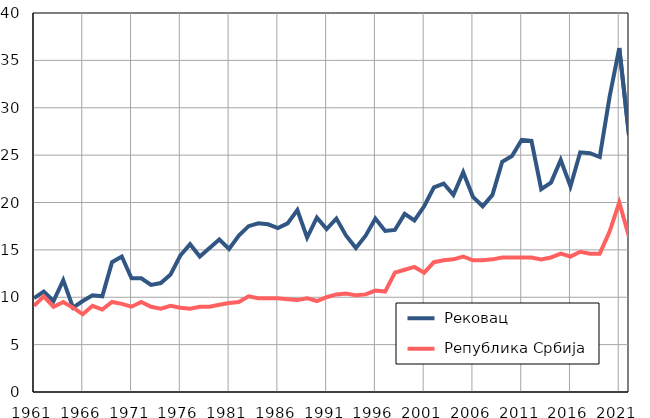
| Category |  Рековац |  Република Србија |
|---|---|---|
| 1961.0 | 9.9 | 9.1 |
| 1962.0 | 10.6 | 10.1 |
| 1963.0 | 9.6 | 9 |
| 1964.0 | 11.8 | 9.5 |
| 1965.0 | 8.9 | 8.9 |
| 1966.0 | 9.6 | 8.2 |
| 1967.0 | 10.2 | 9.1 |
| 1968.0 | 10.1 | 8.7 |
| 1969.0 | 13.7 | 9.5 |
| 1970.0 | 14.3 | 9.3 |
| 1971.0 | 12 | 9 |
| 1972.0 | 12 | 9.5 |
| 1973.0 | 11.3 | 9 |
| 1974.0 | 11.5 | 8.8 |
| 1975.0 | 12.4 | 9.1 |
| 1976.0 | 14.4 | 8.9 |
| 1977.0 | 15.6 | 8.8 |
| 1978.0 | 14.3 | 9 |
| 1979.0 | 15.2 | 9 |
| 1980.0 | 16.1 | 9.2 |
| 1981.0 | 15.1 | 9.4 |
| 1982.0 | 16.5 | 9.5 |
| 1983.0 | 17.5 | 10.1 |
| 1984.0 | 17.8 | 9.9 |
| 1985.0 | 17.7 | 9.9 |
| 1986.0 | 17.3 | 9.9 |
| 1987.0 | 17.8 | 9.8 |
| 1988.0 | 19.2 | 9.7 |
| 1989.0 | 16.3 | 9.9 |
| 1990.0 | 18.4 | 9.6 |
| 1991.0 | 17.2 | 10 |
| 1992.0 | 18.3 | 10.3 |
| 1993.0 | 16.5 | 10.4 |
| 1994.0 | 15.2 | 10.2 |
| 1995.0 | 16.5 | 10.3 |
| 1996.0 | 18.3 | 10.7 |
| 1997.0 | 17 | 10.6 |
| 1998.0 | 17.1 | 12.6 |
| 1999.0 | 18.8 | 12.9 |
| 2000.0 | 18.1 | 13.2 |
| 2001.0 | 19.6 | 12.6 |
| 2002.0 | 21.6 | 13.7 |
| 2003.0 | 22 | 13.9 |
| 2004.0 | 20.8 | 14 |
| 2005.0 | 23.2 | 14.3 |
| 2006.0 | 20.6 | 13.9 |
| 2007.0 | 19.6 | 13.9 |
| 2008.0 | 20.8 | 14 |
| 2009.0 | 24.3 | 14.2 |
| 2010.0 | 24.9 | 14.2 |
| 2011.0 | 26.6 | 14.2 |
| 2012.0 | 26.5 | 14.2 |
| 2013.0 | 21.4 | 14 |
| 2014.0 | 22.1 | 14.2 |
| 2015.0 | 24.5 | 14.6 |
| 2016.0 | 21.7 | 14.3 |
| 2017.0 | 25.3 | 14.8 |
| 2018.0 | 25.2 | 14.6 |
| 2019.0 | 24.8 | 14.6 |
| 2020.0 | 31.1 | 16.9 |
| 2021.0 | 36.3 | 20 |
| 2022.0 | 27.1 | 16.4 |